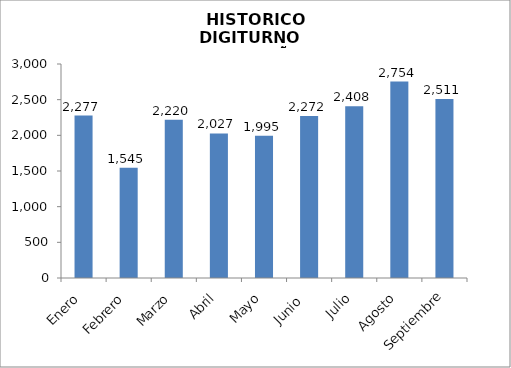
| Category | Series 0 |
|---|---|
| Enero | 2277 |
| Febrero | 1545 |
| Marzo | 2220 |
| Abril  | 2027 |
| Mayo | 1995 |
| Junio  | 2272 |
| Julio | 2408 |
| Agosto | 2754 |
| Septiembre | 2511 |